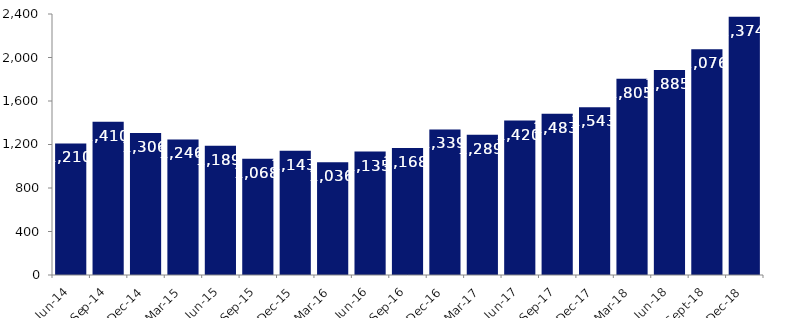
| Category | Series 0 |
|---|---|
| Jun-14 | 1210 |
| Sep-14 | 1410 |
| Dec-14 | 1306 |
| Mar-15 | 1246 |
| Jun-15 | 1189 |
| Sep-15 | 1068 |
| Dec-15 | 1143 |
| Mar-16 | 1036 |
| Jun-16 | 1135 |
| Sep-16 | 1168 |
| Dec-16 | 1339 |
| Mar-17 | 1289 |
| Jun-17 | 1420 |
| Sep-17 | 1483 |
| Dec-17 | 1543 |
| Mar-18 | 1805 |
| Jun-18 | 1885 |
| Sep-18 | 2076 |
| Dec-18 | 2374 |